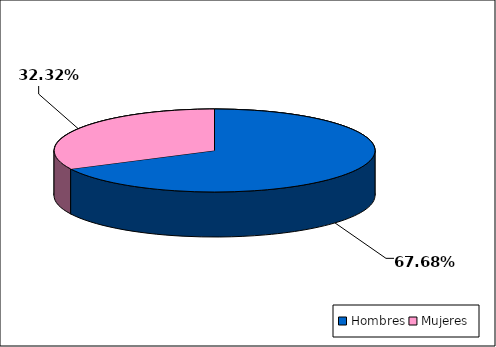
| Category | Series 0 |
|---|---|
| Hombres | 4027 |
| Mujeres | 1923 |